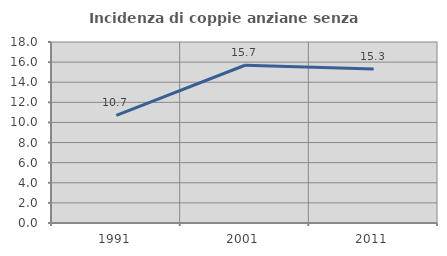
| Category | Incidenza di coppie anziane senza figli  |
|---|---|
| 1991.0 | 10.698 |
| 2001.0 | 15.686 |
| 2011.0 | 15.315 |